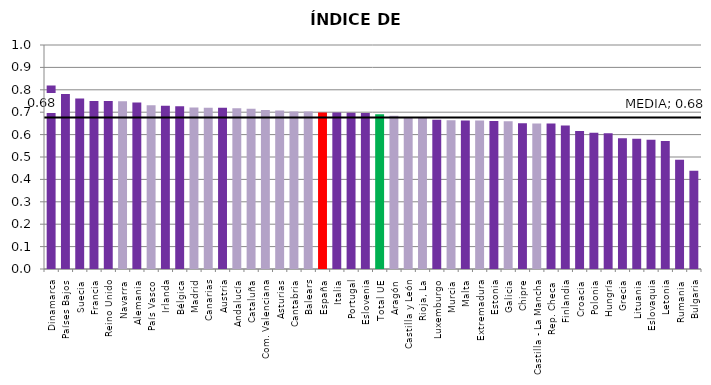
| Category | Series 0 |
|---|---|
| Dinamarca | 0.82 |
| Países Bajos | 0.781 |
| Suecia | 0.761 |
| Francia | 0.75 |
| Reino Unido | 0.75 |
| Navarra | 0.749 |
| Alemania | 0.743 |
| País Vasco | 0.731 |
| Irlanda | 0.728 |
| Bélgica | 0.727 |
| Madrid | 0.721 |
| Canarias | 0.72 |
| Austria | 0.719 |
| Andalucía | 0.718 |
| Cataluña | 0.716 |
| Com. Valenciana | 0.709 |
| Asturias | 0.707 |
| Cantabria | 0.703 |
| Balears | 0.703 |
| España | 0.699 |
| Italia | 0.699 |
| Portugal | 0.697 |
| Eslovenia | 0.696 |
| Total UE | 0.691 |
| Aragón | 0.684 |
| Castilla y León | 0.677 |
| Rioja, La | 0.675 |
| Luxemburgo | 0.667 |
| Murcia | 0.664 |
| Malta | 0.663 |
| Extremadura | 0.663 |
| Estonia | 0.661 |
| Galicia | 0.66 |
| Chipre | 0.651 |
| Castilla - La Mancha | 0.65 |
| Rep. Checa | 0.65 |
| Finlandia | 0.641 |
| Croacia | 0.616 |
| Polonia | 0.609 |
| Hungría | 0.606 |
| Grecia | 0.584 |
| Lituania | 0.582 |
| Eslovaquia | 0.577 |
| Letonia | 0.572 |
| Rumania | 0.488 |
| Bulgaria | 0.439 |